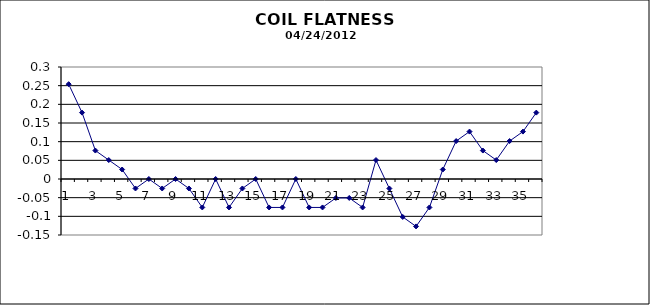
| Category | Series 0 |
|---|---|
| 0 | 0.254 |
| 1 | 0.178 |
| 2 | 0.076 |
| 3 | 0.051 |
| 4 | 0.025 |
| 5 | -0.025 |
| 6 | 0 |
| 7 | -0.025 |
| 8 | 0 |
| 9 | -0.025 |
| 10 | -0.076 |
| 11 | 0 |
| 12 | -0.076 |
| 13 | -0.025 |
| 14 | 0 |
| 15 | -0.076 |
| 16 | -0.076 |
| 17 | 0 |
| 18 | -0.076 |
| 19 | -0.076 |
| 20 | -0.051 |
| 21 | -0.051 |
| 22 | -0.076 |
| 23 | 0.051 |
| 24 | -0.025 |
| 25 | -0.102 |
| 26 | -0.127 |
| 27 | -0.076 |
| 28 | 0.025 |
| 29 | 0.102 |
| 30 | 0.127 |
| 31 | 0.076 |
| 32 | 0.051 |
| 33 | 0.102 |
| 34 | 0.127 |
| 35 | 0.178 |